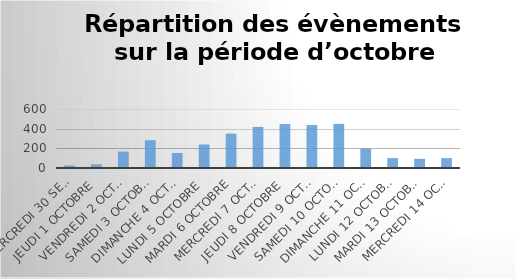
| Category | Mercredi 30 septembre |
|---|---|
| Mercredi 30 septembre | 25 |
| Jeudi 1 octobre | 37 |
| Vendredi 2 octobre | 167 |
| Samedi 3 octobre | 283 |
| Dimanche 4 octobre | 153 |
| Lundi 5 octobre | 239 |
| Mardi 6 octobre | 350 |
| Mercredi 7 octobre | 418 |
| Jeudi 8 octobre | 448 |
| Vendredi 9 octobre | 437 |
| Samedi 10 octobre | 449 |
| Dimanche 11 octobre | 198 |
| Lundi 12 octobre | 101 |
| Mardi 13 octobre | 93 |
| Mercredi 14 octobre | 101 |